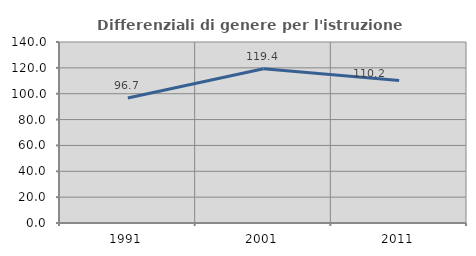
| Category | Differenziali di genere per l'istruzione superiore |
|---|---|
| 1991.0 | 96.684 |
| 2001.0 | 119.363 |
| 2011.0 | 110.164 |